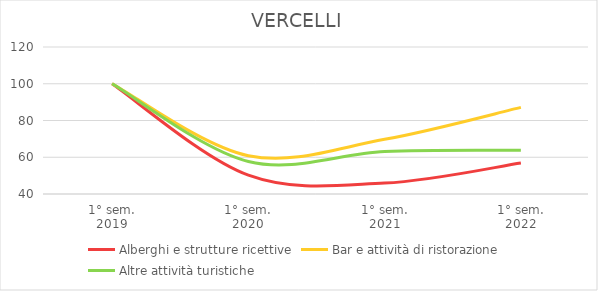
| Category | Alberghi e strutture ricettive | Bar e attività di ristorazione | Altre attività turistiche |
|---|---|---|---|
| 1° sem.
2019 | 100 | 100 | 100 |
| 1° sem.
2020 | 50.254 | 60.821 | 57.692 |
| 1° sem.
2021 | 45.939 | 69.751 | 63.141 |
| 1° sem.
2022 | 56.853 | 87.128 | 63.782 |